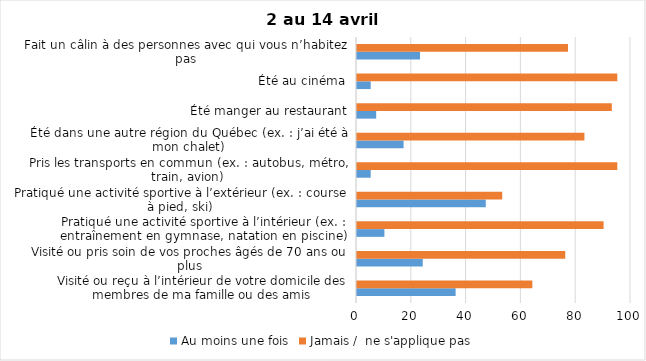
| Category | Au moins une fois | Jamais /  ne s'applique pas |
|---|---|---|
| Visité ou reçu à l’intérieur de votre domicile des membres de ma famille ou des amis | 36 | 64 |
| Visité ou pris soin de vos proches âgés de 70 ans ou plus | 24 | 76 |
| Pratiqué une activité sportive à l’intérieur (ex. : entraînement en gymnase, natation en piscine) | 10 | 90 |
| Pratiqué une activité sportive à l’extérieur (ex. : course à pied, ski) | 47 | 53 |
| Pris les transports en commun (ex. : autobus, métro, train, avion) | 5 | 95 |
| Été dans une autre région du Québec (ex. : j’ai été à mon chalet) | 17 | 83 |
| Été manger au restaurant | 7 | 93 |
| Été au cinéma | 5 | 95 |
| Fait un câlin à des personnes avec qui vous n’habitez pas | 23 | 77 |